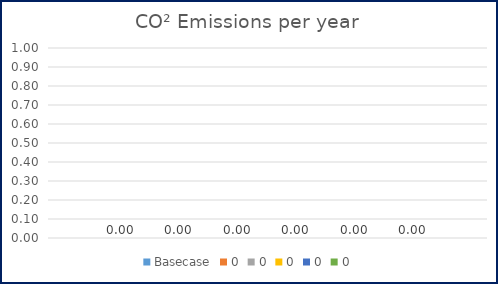
| Category | Basecase | 0 |
|---|---|---|
| 0 | 0 | 0 |